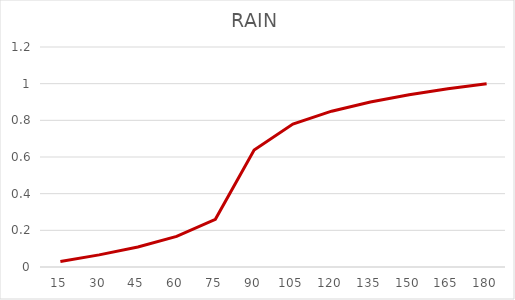
| Category | RAIN |
|---|---|
| 15.0 | 0.03 |
| 30.0 | 0.066 |
| 45.0 | 0.109 |
| 60.0 | 0.167 |
| 75.0 | 0.26 |
| 90.0 | 0.638 |
| 105.0 | 0.78 |
| 120.0 | 0.85 |
| 135.0 | 0.9 |
| 150.0 | 0.939 |
| 165.0 | 0.972 |
| 180.0 | 1 |